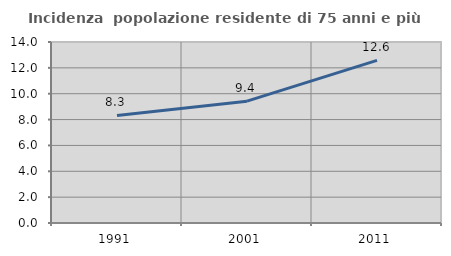
| Category | Incidenza  popolazione residente di 75 anni e più |
|---|---|
| 1991.0 | 8.322 |
| 2001.0 | 9.424 |
| 2011.0 | 12.583 |